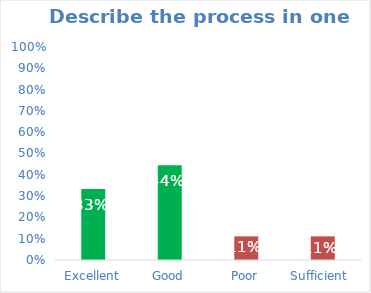
| Category | Series 0 |
|---|---|
| Excellent | 0.333 |
| Good | 0.444 |
| Poor | 0.111 |
| Sufficient  | 0.111 |